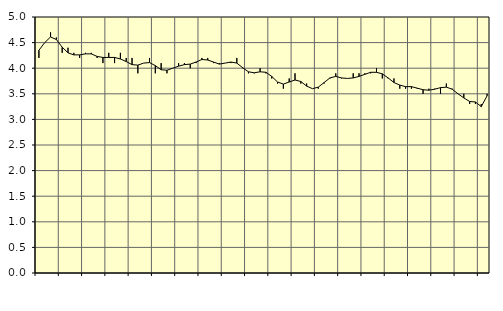
| Category | Piggar | Jordbruk, skogsbruk o fiske, SNI 01-03 |
|---|---|---|
| nan | 4.2 | 4.35 |
| 1.0 | 4.5 | 4.5 |
| 1.0 | 4.7 | 4.61 |
| 1.0 | 4.6 | 4.56 |
| nan | 4.3 | 4.41 |
| 2.0 | 4.4 | 4.3 |
| 2.0 | 4.3 | 4.26 |
| 2.0 | 4.2 | 4.26 |
| nan | 4.3 | 4.28 |
| 3.0 | 4.3 | 4.28 |
| 3.0 | 4.2 | 4.23 |
| 3.0 | 4.1 | 4.21 |
| nan | 4.3 | 4.21 |
| 4.0 | 4.1 | 4.21 |
| 4.0 | 4.3 | 4.18 |
| 4.0 | 4.2 | 4.13 |
| nan | 4.2 | 4.07 |
| 5.0 | 3.9 | 4.06 |
| 5.0 | 4.1 | 4.1 |
| 5.0 | 4.2 | 4.11 |
| nan | 3.9 | 4.05 |
| 6.0 | 4.1 | 3.97 |
| 6.0 | 3.9 | 3.96 |
| 6.0 | 4 | 4 |
| nan | 4.1 | 4.04 |
| 7.0 | 4.1 | 4.07 |
| 7.0 | 4 | 4.08 |
| 7.0 | 4.1 | 4.12 |
| nan | 4.2 | 4.17 |
| 8.0 | 4.2 | 4.16 |
| 8.0 | 4.1 | 4.12 |
| 8.0 | 4.1 | 4.08 |
| nan | 4.1 | 4.1 |
| 9.0 | 4.1 | 4.12 |
| 9.0 | 4.2 | 4.1 |
| 9.0 | 4 | 4.01 |
| nan | 3.9 | 3.93 |
| 10.0 | 3.9 | 3.91 |
| 10.0 | 4 | 3.93 |
| 10.0 | 3.9 | 3.92 |
| nan | 3.8 | 3.84 |
| 11.0 | 3.7 | 3.73 |
| 11.0 | 3.6 | 3.69 |
| 11.0 | 3.8 | 3.73 |
| nan | 3.9 | 3.77 |
| 12.0 | 3.7 | 3.74 |
| 12.0 | 3.7 | 3.65 |
| 12.0 | 3.6 | 3.6 |
| nan | 3.6 | 3.63 |
| 13.0 | 3.7 | 3.72 |
| 13.0 | 3.8 | 3.81 |
| 13.0 | 3.9 | 3.84 |
| nan | 3.8 | 3.81 |
| 14.0 | 3.8 | 3.8 |
| 14.0 | 3.9 | 3.81 |
| 14.0 | 3.9 | 3.84 |
| nan | 3.9 | 3.88 |
| 15.0 | 3.9 | 3.92 |
| 15.0 | 4 | 3.92 |
| 15.0 | 3.8 | 3.89 |
| nan | 3.8 | 3.81 |
| 16.0 | 3.8 | 3.72 |
| 16.0 | 3.6 | 3.67 |
| 16.0 | 3.6 | 3.64 |
| nan | 3.6 | 3.64 |
| 17.0 | 3.6 | 3.61 |
| 17.0 | 3.5 | 3.58 |
| 17.0 | 3.6 | 3.57 |
| nan | 3.6 | 3.59 |
| 18.0 | 3.5 | 3.62 |
| 18.0 | 3.7 | 3.63 |
| 18.0 | 3.6 | 3.59 |
| nan | 3.5 | 3.5 |
| 19.0 | 3.5 | 3.42 |
| 19.0 | 3.3 | 3.35 |
| 19.0 | 3.3 | 3.34 |
| nan | 3.3 | 3.25 |
| 20.0 | 3.5 | 3.46 |